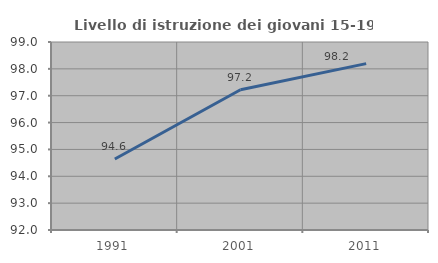
| Category | Livello di istruzione dei giovani 15-19 anni |
|---|---|
| 1991.0 | 94.643 |
| 2001.0 | 97.222 |
| 2011.0 | 98.194 |